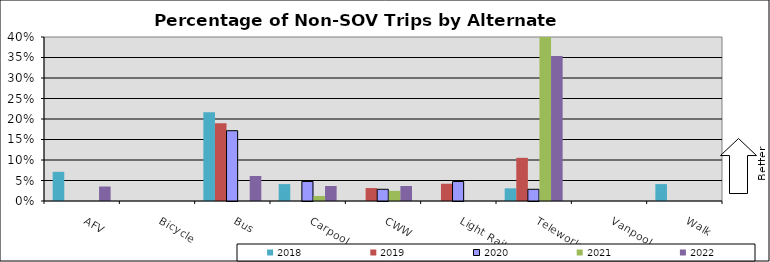
| Category | 2018 | 2019 | 2020 | 2021 | 2022 |
|---|---|---|---|---|---|
| AFV | 0.071 | 0 | 0 | 0 | 0.035 |
| Bicycle | 0 | 0 | 0 | 0 | 0 |
| Bus | 0.216 | 0.189 | 0.171 | 0 | 0.061 |
| Carpool | 0.041 | 0 | 0.048 | 0.012 | 0.037 |
| CWW | 0 | 0.032 | 0.029 | 0.025 | 0.037 |
| Light Rail | 0 | 0.042 | 0.048 | 0 | 0 |
| Telework | 0.031 | 0.105 | 0.029 | 0.728 | 0.354 |
| Vanpool | 0 | 0 | 0 | 0 | 0 |
| Walk | 0.041 | 0 | 0 | 0 | 0 |